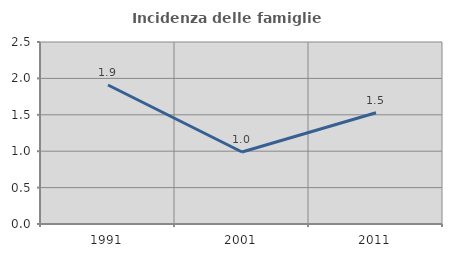
| Category | Incidenza delle famiglie numerose |
|---|---|
| 1991.0 | 1.909 |
| 2001.0 | 0.989 |
| 2011.0 | 1.528 |